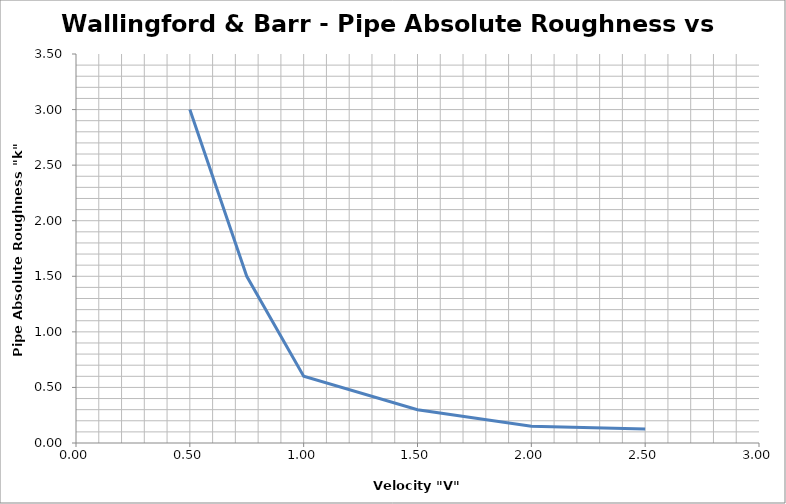
| Category | Pipe Absolute 
Roughness 
"k" 
(mm) |
|---|---|
| 0.5 | 3 |
| 0.75 | 1.5 |
| 1.0 | 0.6 |
| 1.5 | 0.3 |
| 2.0 | 0.15 |
| 2.5 | 0.125 |